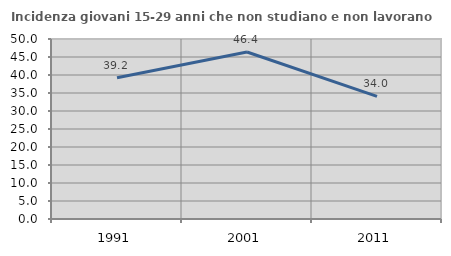
| Category | Incidenza giovani 15-29 anni che non studiano e non lavorano  |
|---|---|
| 1991.0 | 39.246 |
| 2001.0 | 46.387 |
| 2011.0 | 34.05 |